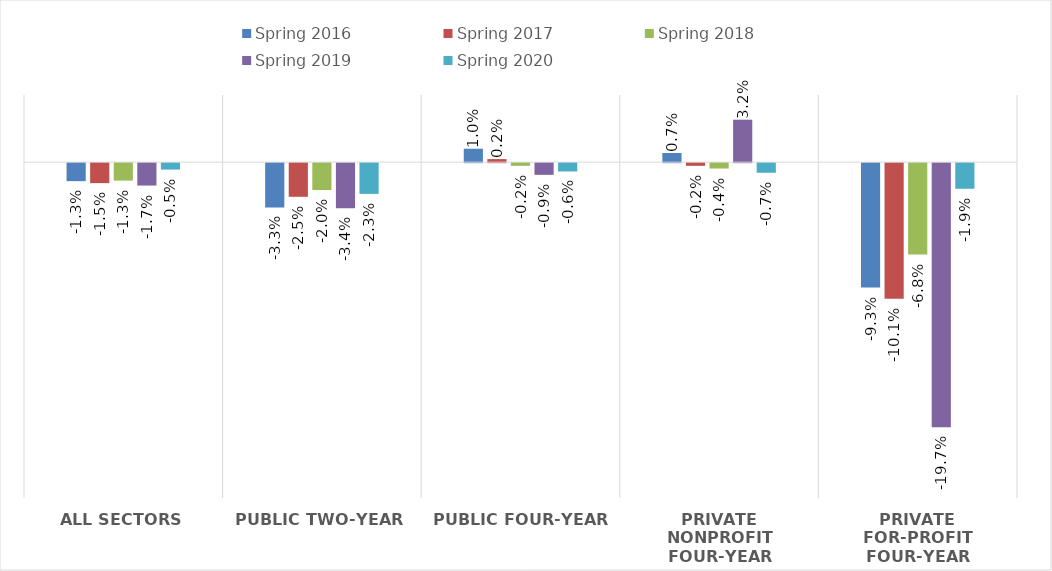
| Category | Spring 2016 | Spring 2017 | Spring 2018 | Spring 2019 | Spring 2020 |
|---|---|---|---|---|---|
| All Sectors | -0.013 | -0.015 | -0.013 | -0.017 | -0.005 |
| Public two-year | -0.033 | -0.025 | -0.02 | -0.034 | -0.023 |
| Public four-year | 0.01 | 0.002 | -0.002 | -0.009 | -0.006 |
| Private nonprofit four-year | 0.007 | -0.002 | -0.004 | 0.032 | -0.007 |
| Private for-profit four-year | -0.093 | -0.101 | -0.068 | -0.197 | -0.019 |